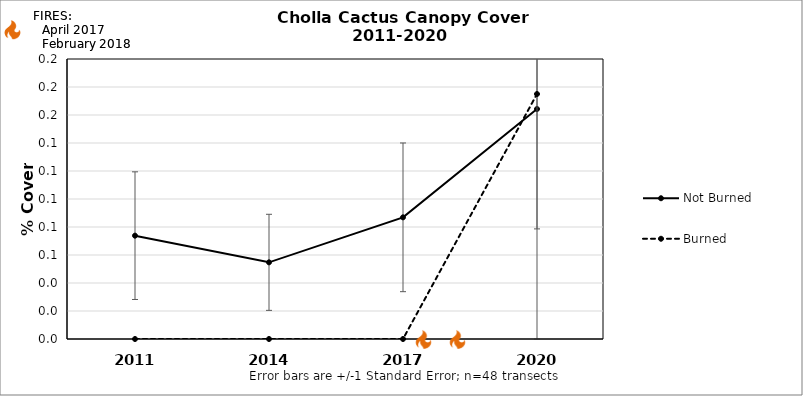
| Category | Not Burned | Burned |
|---|---|---|
| 2011.0 | 0.074 | 0 |
| 2014.0 | 0.055 | 0 |
| 2017.0 | 0.087 | 0 |
| 2020.0 | 0.164 | 0.175 |